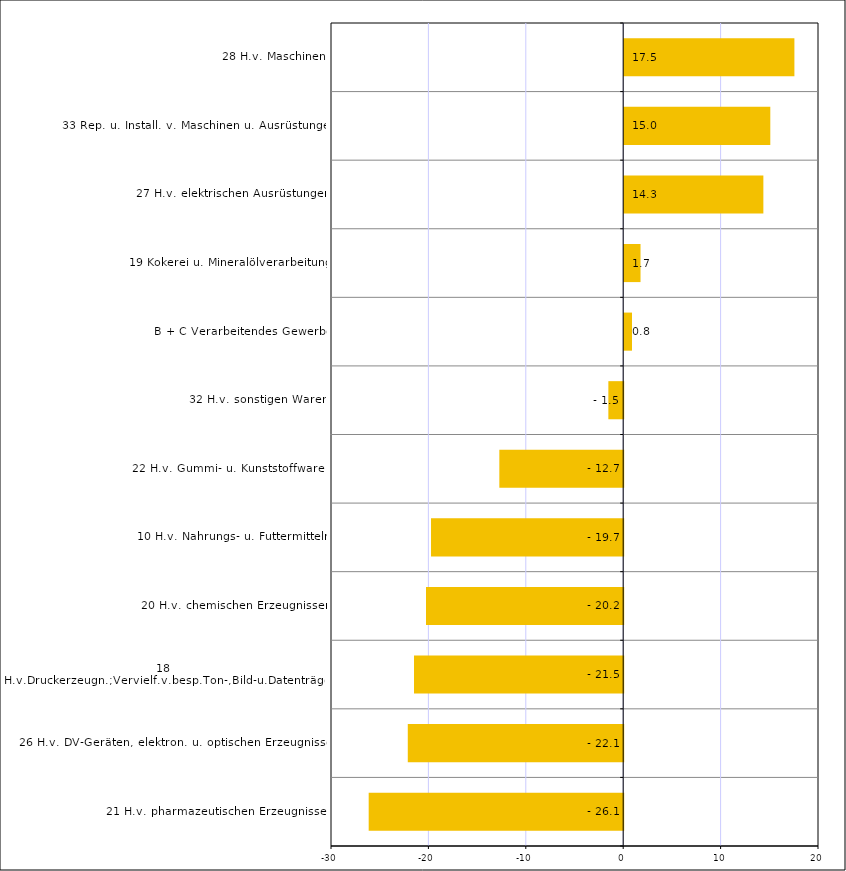
| Category | Series 0 |
|---|---|
| 21 H.v. pharmazeutischen Erzeugnissen | -26.131 |
| 26 H.v. DV-Geräten, elektron. u. optischen Erzeugnissen | -22.117 |
| 18 H.v.Druckerzeugn.;Vervielf.v.besp.Ton-,Bild-u.Datenträgern | -21.477 |
| 20 H.v. chemischen Erzeugnissen | -20.246 |
| 10 H.v. Nahrungs- u. Futtermitteln | -19.731 |
| 22 H.v. Gummi- u. Kunststoffwaren | -12.717 |
| 32 H.v. sonstigen Waren | -1.524 |
| B + C Verarbeitendes Gewerbe | 0.799 |
| 19 Kokerei u. Mineralölverarbeitung | 1.676 |
| 27 H.v. elektrischen Ausrüstungen | 14.288 |
| 33 Rep. u. Install. v. Maschinen u. Ausrüstungen | 15 |
| 28 H.v. Maschinen | 17.475 |